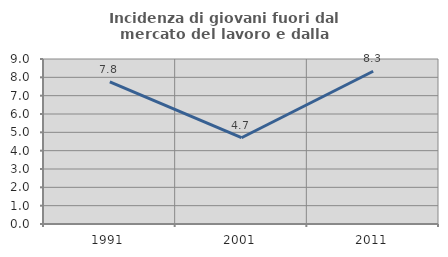
| Category | Incidenza di giovani fuori dal mercato del lavoro e dalla formazione  |
|---|---|
| 1991.0 | 7.752 |
| 2001.0 | 4.706 |
| 2011.0 | 8.333 |